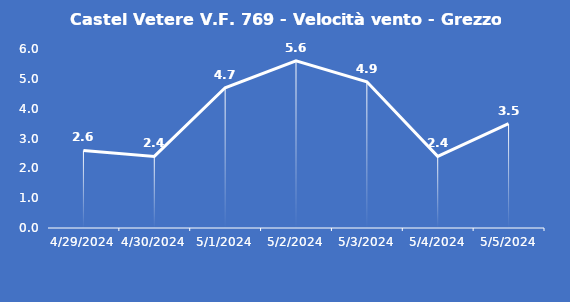
| Category | Castel Vetere V.F. 769 - Velocità vento - Grezzo (m/s) |
|---|---|
| 4/29/24 | 2.6 |
| 4/30/24 | 2.4 |
| 5/1/24 | 4.7 |
| 5/2/24 | 5.6 |
| 5/3/24 | 4.9 |
| 5/4/24 | 2.4 |
| 5/5/24 | 3.5 |